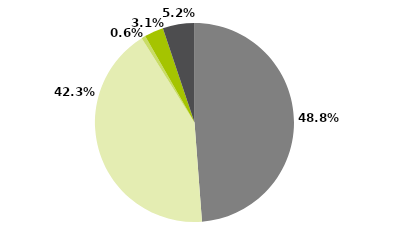
| Category | Series 0 |
|---|---|
| Multimercados Macro | 0.488 |
| Multimercados Livre | 0.423 |
| Multimercados L/S - Neutro | 0.006 |
| Multimercados L/S - Direcional | 0.031 |
| Outros | 0.052 |